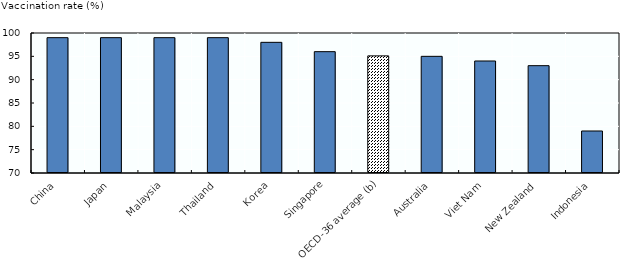
| Category | Series 1 |
|---|---|
| China | 99 |
| Japan | 99 |
| Malaysia | 99 |
| Thailand | 99 |
| Korea | 98 |
| Singapore | 96 |
| OECD-36 average (b) | 95.1 |
| Australia | 95 |
| Viet Nam | 94 |
| New Zealand | 93 |
| Indonesia | 79 |